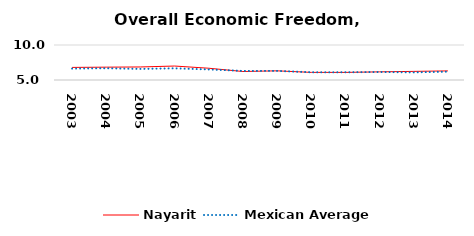
| Category | Nayarit | Mexican Average  |
|---|---|---|
| 2003.0 | 6.798 | 6.632 |
| 2004.0 | 6.834 | 6.678 |
| 2005.0 | 6.863 | 6.582 |
| 2006.0 | 6.995 | 6.668 |
| 2007.0 | 6.683 | 6.508 |
| 2008.0 | 6.214 | 6.3 |
| 2009.0 | 6.31 | 6.3 |
| 2010.0 | 6.087 | 6.105 |
| 2011.0 | 6.085 | 6.103 |
| 2012.0 | 6.164 | 6.144 |
| 2013.0 | 6.23 | 6.087 |
| 2014.0 | 6.3 | 6.195 |